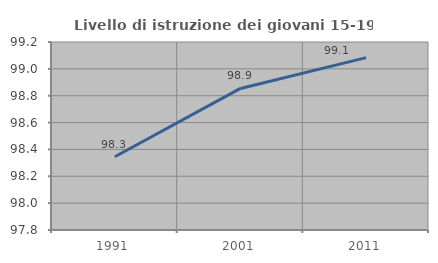
| Category | Livello di istruzione dei giovani 15-19 anni |
|---|---|
| 1991.0 | 98.346 |
| 2001.0 | 98.854 |
| 2011.0 | 99.083 |